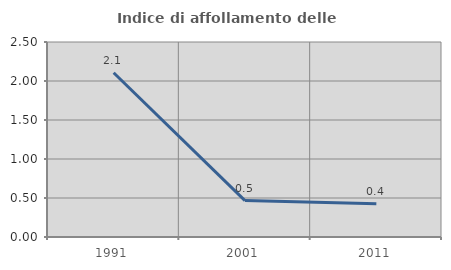
| Category | Indice di affollamento delle abitazioni  |
|---|---|
| 1991.0 | 2.105 |
| 2001.0 | 0.467 |
| 2011.0 | 0.426 |